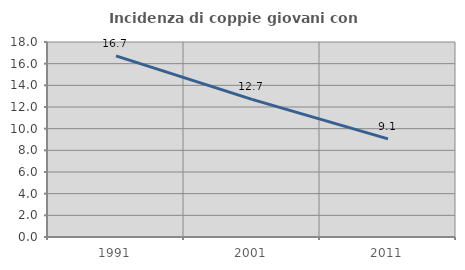
| Category | Incidenza di coppie giovani con figli |
|---|---|
| 1991.0 | 16.719 |
| 2001.0 | 12.709 |
| 2011.0 | 9.057 |